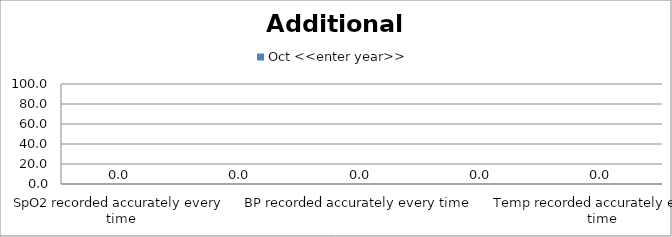
| Category | Oct <<enter year>> |
|---|---|
| SpO2 recorded accurately every time | 0 |
| CRT recorded accurately every time | 0 |
| BP recorded accurately every time | 0 |
| Skin Colour recorded accurately every time | 0 |
| Temp recorded accurately every time | 0 |